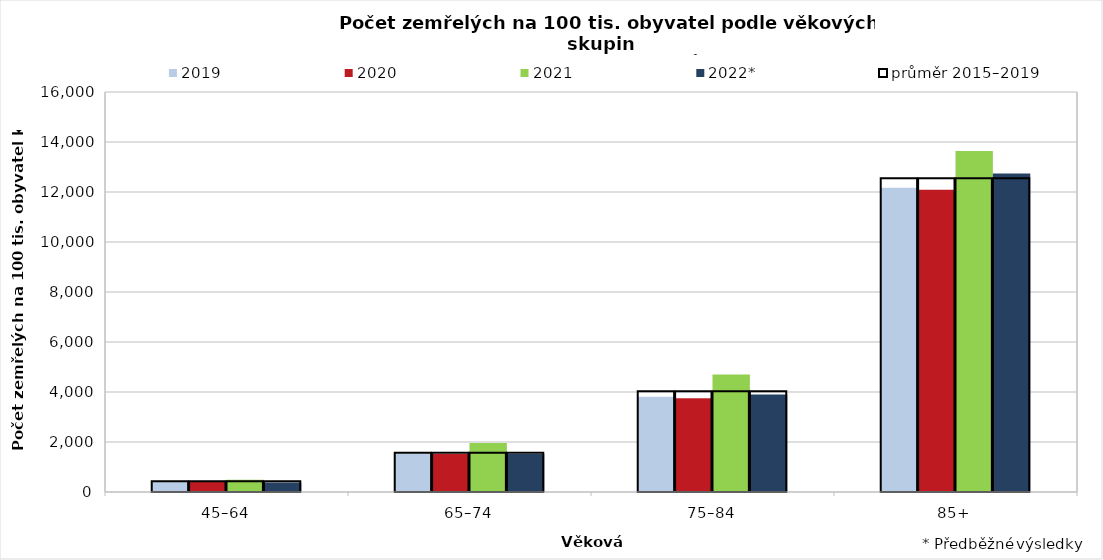
| Category | 2019 | 2020 | 2021 | 2022* |
|---|---|---|---|---|
| 45–64 | 413.758 | 397.268 | 491.012 | 384.563 |
| 65–74 | 1526.837 | 1522.973 | 1957.47 | 1522.74 |
| 75–84 | 3811.68 | 3752.776 | 4695.043 | 3903.783 |
| 85+ | 12174.89 | 12089.736 | 13642.333 | 12742.159 |